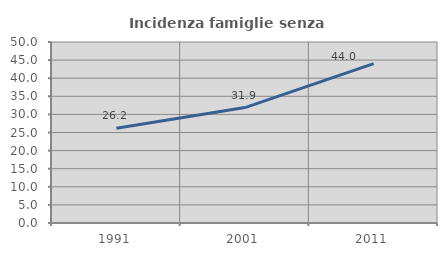
| Category | Incidenza famiglie senza nuclei |
|---|---|
| 1991.0 | 26.185 |
| 2001.0 | 31.888 |
| 2011.0 | 44.041 |